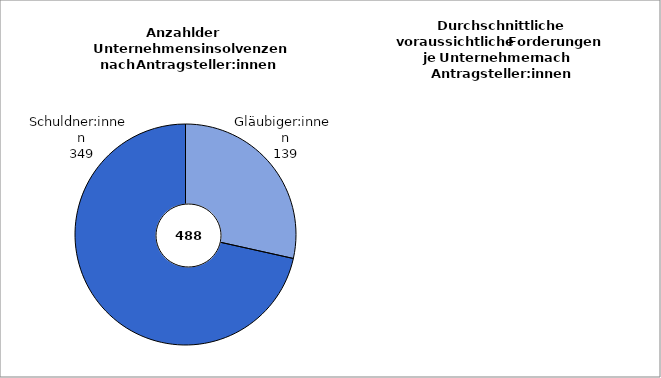
| Category | Series 0 |
|---|---|
| Gläubiger:innen | 139 |
| Schuldner:innen | 349 |